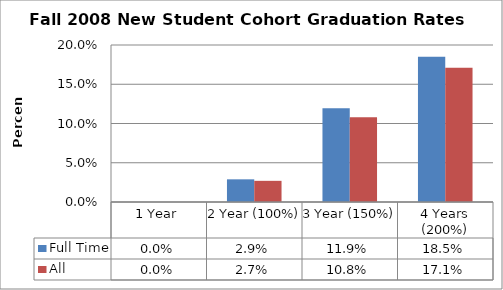
| Category | Full Time | All  |
|---|---|---|
| 1 Year | 0 | 0 |
| 2 Year (100%) | 0.029 | 0.027 |
| 3 Year (150%) | 0.119 | 0.108 |
| 4 Years (200%) | 0.185 | 0.171 |